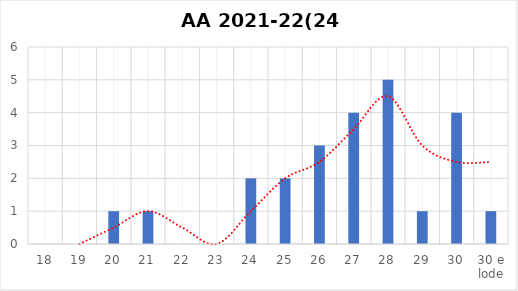
| Category | Series 0 |
|---|---|
| 18 | 0 |
| 19 | 0 |
| 20 | 1 |
| 21 | 1 |
| 22 | 0 |
| 23 | 0 |
| 24 | 2 |
| 25 | 2 |
| 26 | 3 |
| 27 | 4 |
| 28 | 5 |
| 29 | 1 |
| 30 | 4 |
| 30 e lode | 1 |